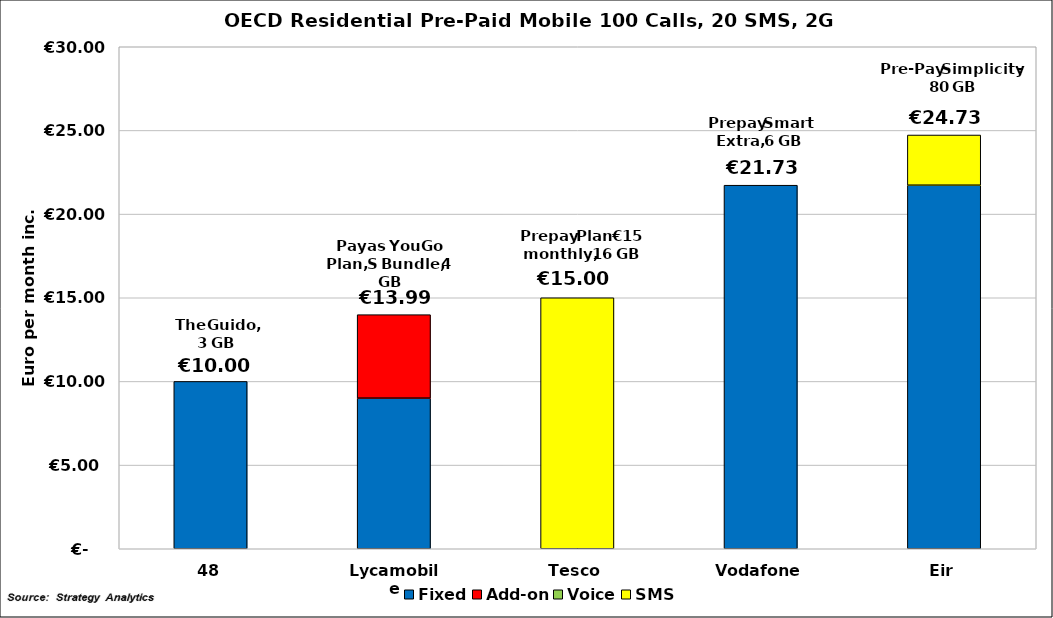
| Category | Fixed | Add-on | Voice | SMS | Data |
|---|---|---|---|---|---|
| 48 | 10 | 0 | 0 | 0 | 0 |
| Lycamobile | 9 | 4.99 | 0 | 0 | 0 |
| Tesco | 0 | 0 | 0 | 15 | 0 |
| Vodafone | 21.726 | 0 | 0 | 0 | 0 |
| Eir | 21.726 | 0 | 0 | 3 | 0 |